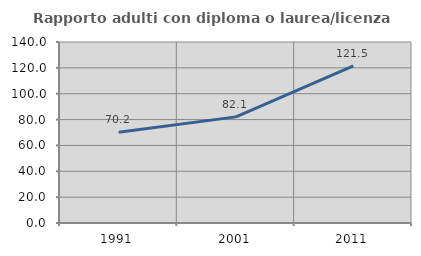
| Category | Rapporto adulti con diploma o laurea/licenza media  |
|---|---|
| 1991.0 | 70.192 |
| 2001.0 | 82.09 |
| 2011.0 | 121.515 |